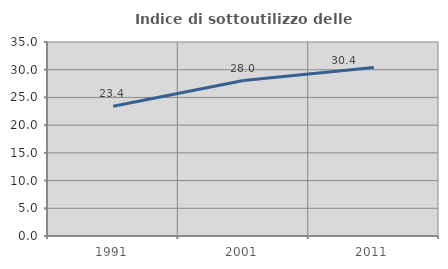
| Category | Indice di sottoutilizzo delle abitazioni  |
|---|---|
| 1991.0 | 23.401 |
| 2001.0 | 28.048 |
| 2011.0 | 30.39 |